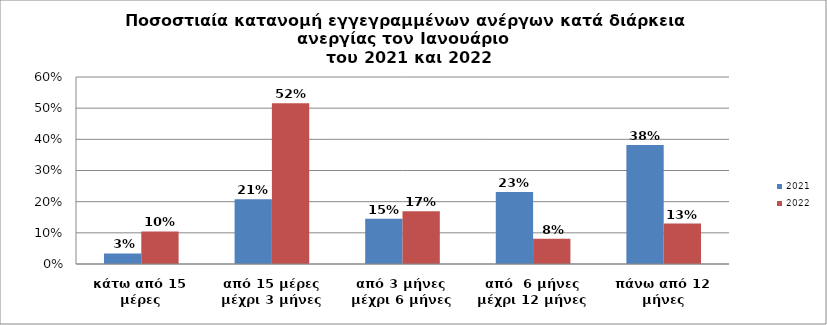
| Category | 2021 | 2022 |
|---|---|---|
| κάτω από 15 μέρες | 0.034 | 0.105 |
| από 15 μέρες μέχρι 3 μήνες | 0.208 | 0.516 |
| από 3 μήνες μέχρι 6 μήνες | 0.146 | 0.169 |
| από  6 μήνες μέχρι 12 μήνες | 0.231 | 0.081 |
| πάνω από 12 μήνες | 0.382 | 0.13 |